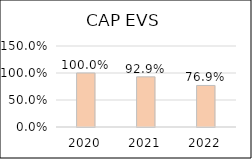
| Category | CAP EPC (EVS jusqu'à 2021) |
|---|---|
| 2020.0 | 1 |
| 2021.0 | 0.929 |
| 2022.0 | 0.769 |